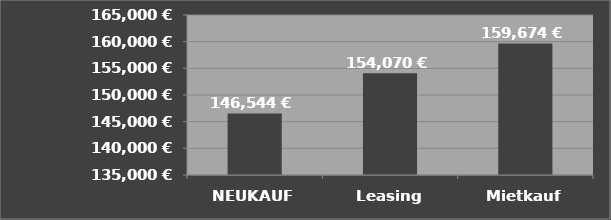
| Category | Summe mit
Zinsen + Gebühren |
|---|---|
| NEUKAUF | 146544 |
| Leasing | 154070.217 |
| Mietkauf | 159674.492 |